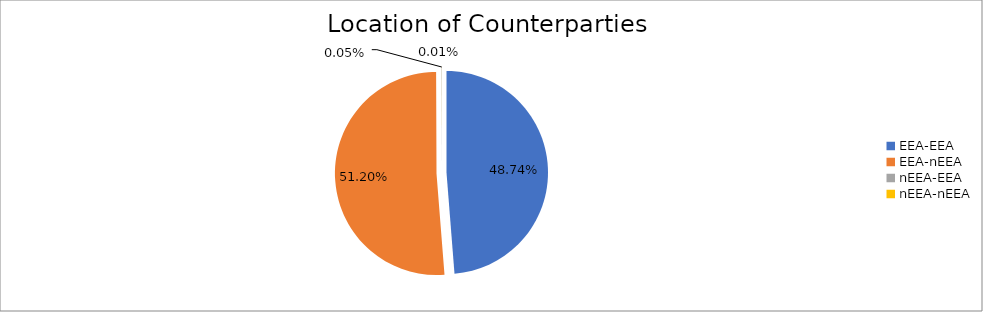
| Category | Series 0 |
|---|---|
| EEA-EEA | 6473195.362 |
| EEA-nEEA | 6799213.093 |
| nEEA-EEA | 6928.901 |
| nEEA-nEEA | 1199.871 |